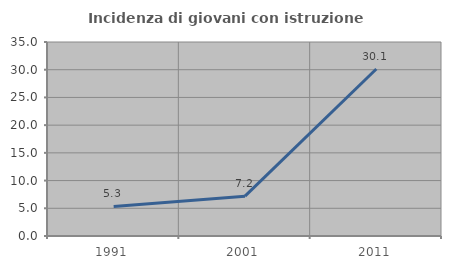
| Category | Incidenza di giovani con istruzione universitaria |
|---|---|
| 1991.0 | 5.344 |
| 2001.0 | 7.19 |
| 2011.0 | 30.12 |